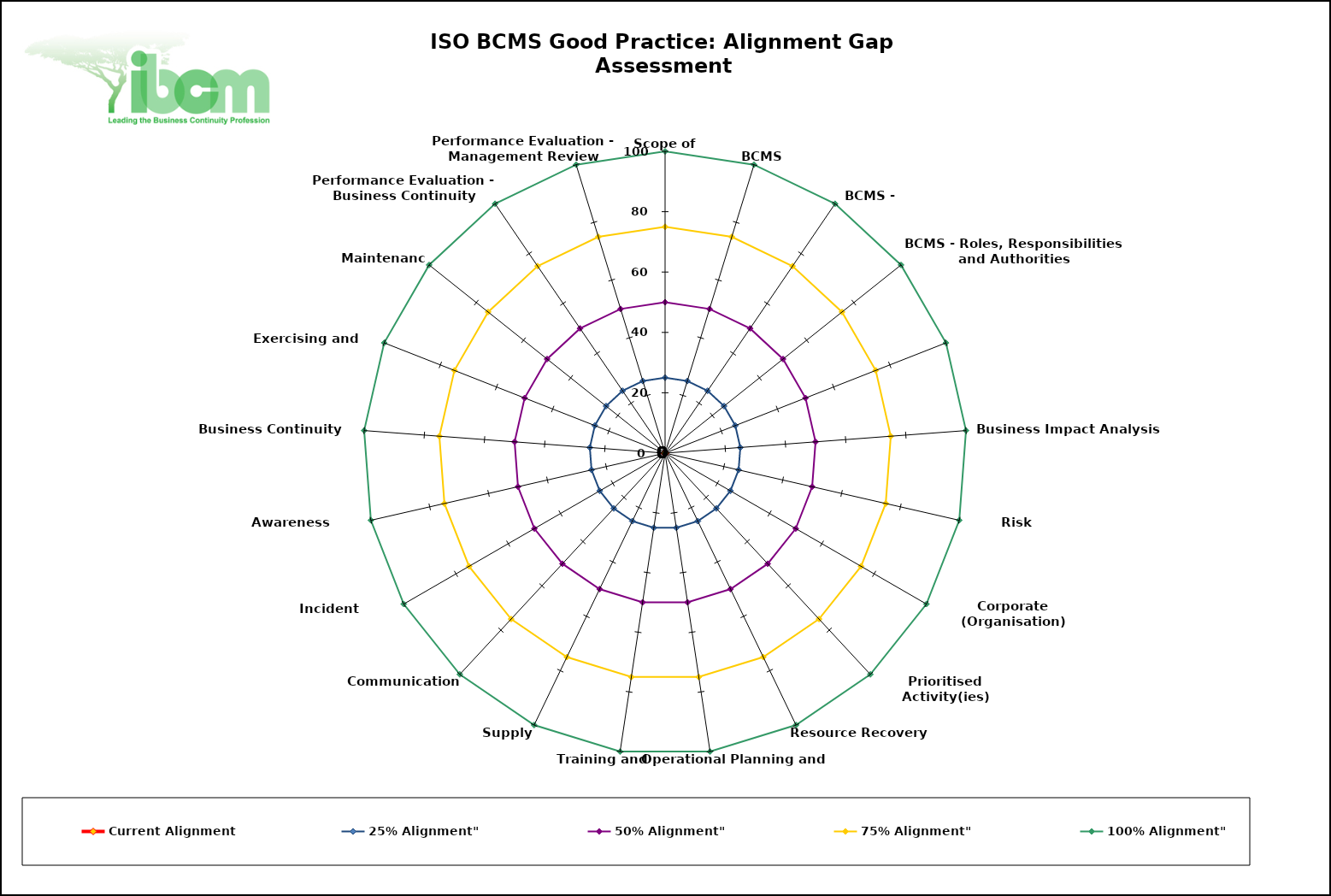
| Category | Current Alignment | 25% Alignment" | 50% Alignment" | 75% Alignment" | 100% Alignment" |
|---|---|---|---|---|---|
| Scope of BCMS | 0 | 25 | 50 | 75 | 100 |
| BCMS | 0 | 25 | 50 | 75 | 100 |
| BCMS - Policy | 0 | 25 | 50 | 75 | 100 |
| BCMS - Roles, Responsibilities and Authorities | 0 | 25 | 50 | 75 | 100 |
|    Assurance | 0 | 25 | 50 | 75 | 100 |
| Business Impact Analysis (BIA) | 0 | 25 | 50 | 75 | 100 |
| Risk Assessment | 0 | 25 | 50 | 75 | 100 |
| Corporate (Organisation)
Strategy | 0 | 25 | 50 | 75 | 100 |
| Prioritised Activity(ies)
  Recovery Strategy | 0 | 25 | 50 | 75 | 100 |
|    Resource Recovery Strategy | 0 | 25 | 50 | 75 | 100 |
|   Operational Planning and Control | 0 | 25 | 50 | 75 | 100 |
| Training and Competence | 0 | 25 | 50 | 75 | 100 |
| Supply Chain | 0 | 25 | 50 | 75 | 100 |
| Communications | 0 | 25 | 50 | 75 | 100 |
| Incident Management | 0 | 25 | 50 | 75 | 100 |
| Awareness Programme | 0 | 25 | 50 | 75 | 100 |
| Business Continuity Plan(s) | 0 | 25 | 50 | 75 | 100 |
| Exercising and Testing | 0 | 25 | 50 | 75 | 100 |
| Maintenance | 0 | 25 | 50 | 75 | 100 |
| Performance Evaluation - Business Continuity Arrangements | 0 | 25 | 50 | 75 | 100 |
| Performance Evaluation - Management Review | 0 | 25 | 50 | 75 | 100 |